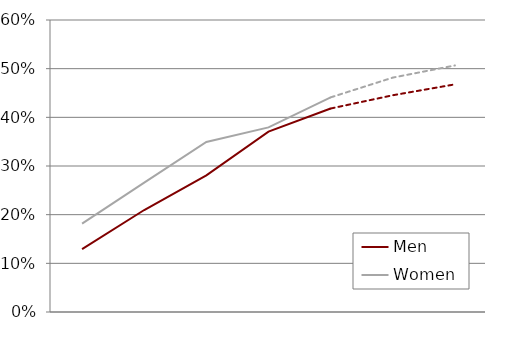
| Category | Men | Women |
|---|---|---|
| 1978.0 | 0.129 | 0.182 |
| 1991.0 | 0.21 | 0.266 |
| 2001.0 | 0.281 | 0.349 |
| 2010.0 | 0.371 | 0.379 |
| 2020.0 | 0.418 | 0.441 |
| 2030.0 | 0.445 | 0.482 |
| 2040.0 | 0.468 | 0.507 |